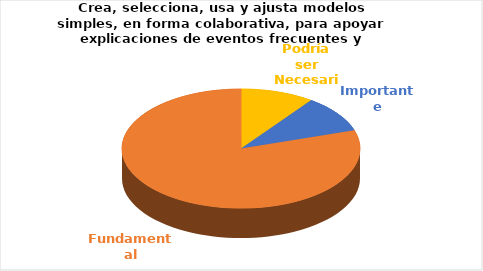
| Category | Series 0 |
|---|---|
| Podría ser Necesaria | 1 |
| Importante | 1 |
| Fundamental | 8 |